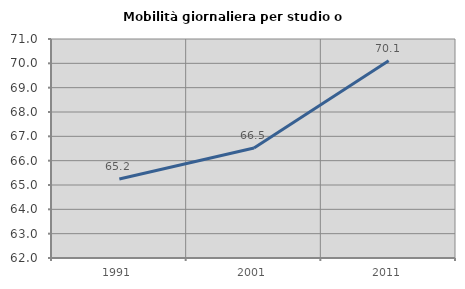
| Category | Mobilità giornaliera per studio o lavoro |
|---|---|
| 1991.0 | 65.245 |
| 2001.0 | 66.521 |
| 2011.0 | 70.11 |